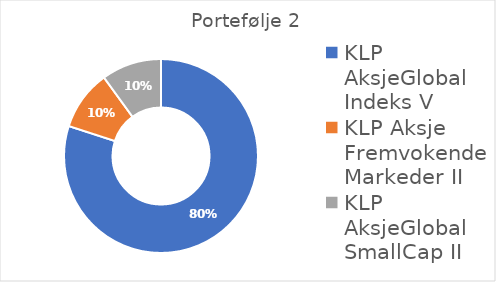
| Category | Series 0 |
|---|---|
| KLP AksjeGlobal Indeks V | 0.8 |
| KLP Aksje Fremvokende Markeder II | 0.1 |
| KLP AksjeGlobal SmallCap II | 0.1 |